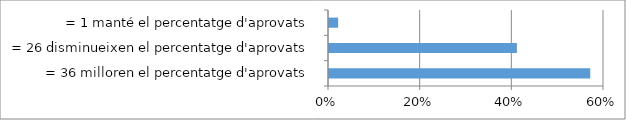
| Category | Series 0 |
|---|---|
| = 36 milloren el percentatge d'aprovats | 0.57 |
| = 26 disminueixen el percentatge d'aprovats | 0.41 |
| = 1 manté el percentatge d'aprovats | 0.02 |